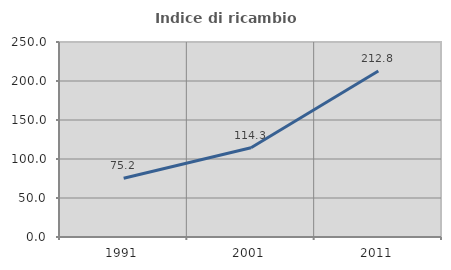
| Category | Indice di ricambio occupazionale  |
|---|---|
| 1991.0 | 75.234 |
| 2001.0 | 114.323 |
| 2011.0 | 212.847 |